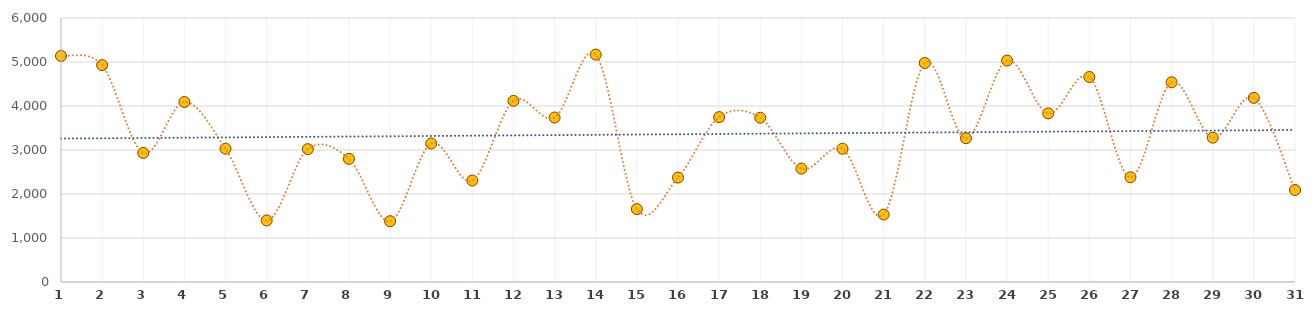
| Category | Series 0 |
|---|---|
| 1.0 | 5137 |
| 2.0 | 4929 |
| 3.0 | 2933 |
| 4.0 | 4091 |
| 5.0 | 3030 |
| 6.0 | 1399 |
| 7.0 | 3020 |
| 8.0 | 2798 |
| 9.0 | 1382 |
| 10.0 | 3148 |
| 11.0 | 2307 |
| 12.0 | 4117 |
| 13.0 | 3738 |
| 14.0 | 5168 |
| 15.0 | 1657 |
| 16.0 | 2373 |
| 17.0 | 3748 |
| 18.0 | 3734 |
| 19.0 | 2577 |
| 20.0 | 3029 |
| 21.0 | 1533 |
| 22.0 | 4977 |
| 23.0 | 3267 |
| 24.0 | 5033 |
| 25.0 | 3832 |
| 26.0 | 4660 |
| 27.0 | 2379 |
| 28.0 | 4539 |
| 29.0 | 3281 |
| 30.0 | 4185 |
| 31.0 | 2091 |